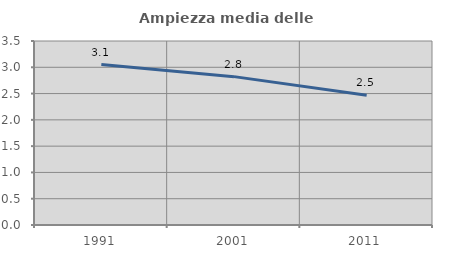
| Category | Ampiezza media delle famiglie |
|---|---|
| 1991.0 | 3.052 |
| 2001.0 | 2.822 |
| 2011.0 | 2.467 |